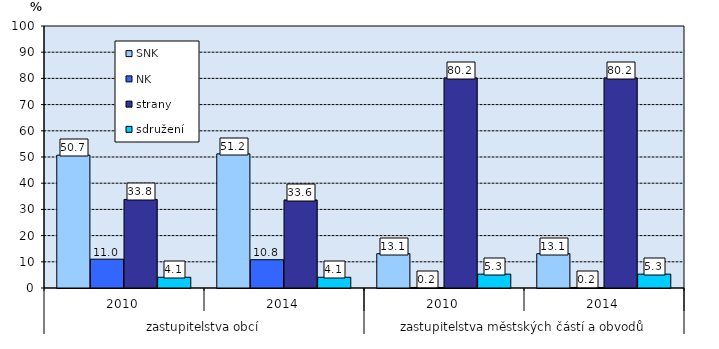
| Category | SNK | NK | strany | sdružení |
|---|---|---|---|---|
| 0 | 50.7 | 11 | 33.8 | 4.1 |
| 1 | 51.2 | 10.8 | 33.6 | 4.1 |
| 2 | 13.1 | 0.2 | 80.2 | 5.3 |
| 3 | 13.1 | 0.2 | 80.2 | 5.3 |